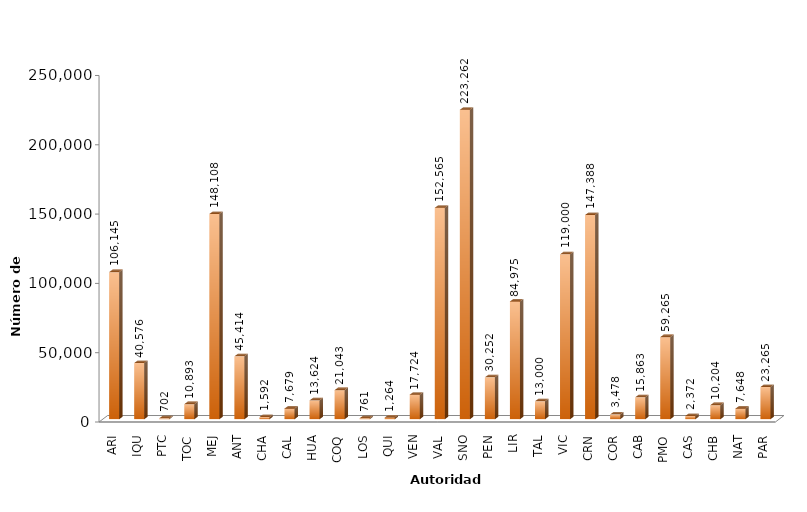
| Category | Series 0 |
|---|---|
| ARI | 106145 |
| IQU | 40576 |
| PTC | 702 |
| TOC | 10893 |
| MEJ | 148108 |
| ANT | 45414 |
| CHA | 1592 |
| CAL | 7679 |
| HUA | 13624 |
| COQ | 21043 |
| LOS | 761 |
| QUI | 1264 |
| VEN | 17724 |
| VAL | 152565 |
| SNO | 223262 |
| PEN | 30252 |
| LIR | 84975 |
| TAL | 13000 |
| VIC | 119000 |
| CRN | 147388 |
| COR | 3478 |
| CAB | 15863 |
| PMO | 59265 |
| CAS | 2372 |
| CHB | 10204 |
| NAT | 7648 |
| PAR | 23265 |